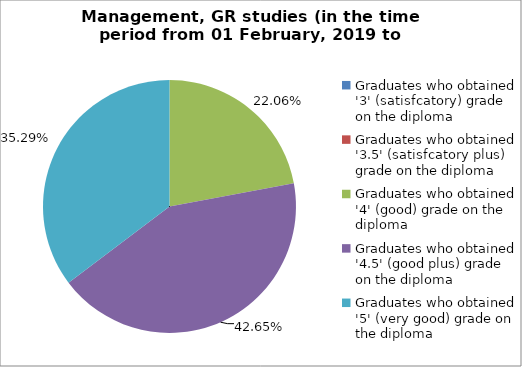
| Category | Series 0 |
|---|---|
| Graduates who obtained '3' (satisfcatory) grade on the diploma  | 0 |
| Graduates who obtained '3.5' (satisfcatory plus) grade on the diploma  | 0 |
| Graduates who obtained '4' (good) grade on the diploma  | 22.059 |
| Graduates who obtained '4.5' (good plus) grade on the diploma  | 42.647 |
| Graduates who obtained '5' (very good) grade on the diploma  | 35.294 |